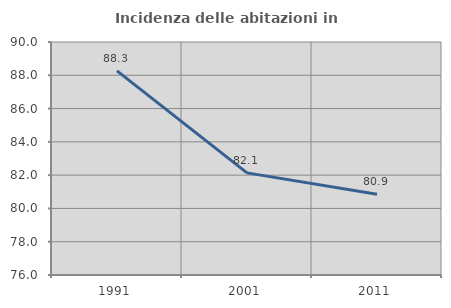
| Category | Incidenza delle abitazioni in proprietà  |
|---|---|
| 1991.0 | 88.261 |
| 2001.0 | 82.135 |
| 2011.0 | 80.851 |